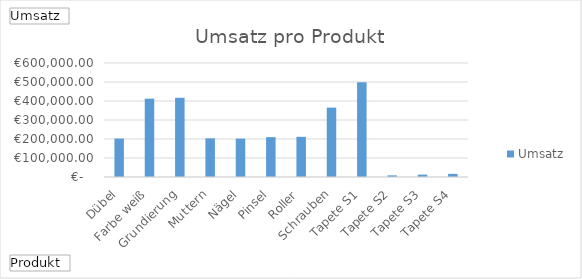
| Category | Ergebnis |
|---|---|
| Dübel | 202290.782 |
| Farbe weiß | 412180.527 |
| Grundierung | 416849.364 |
| Muttern | 203345.2 |
| Nägel | 201897.491 |
| Pinsel | 209830.745 |
| Roller | 211396.455 |
| Schrauben | 365122.036 |
| Tapete S1 | 498814.041 |
| Tapete S2 | 8625.1 |
| Tapete S3 | 12542.85 |
| Tapete S4 | 16460.6 |